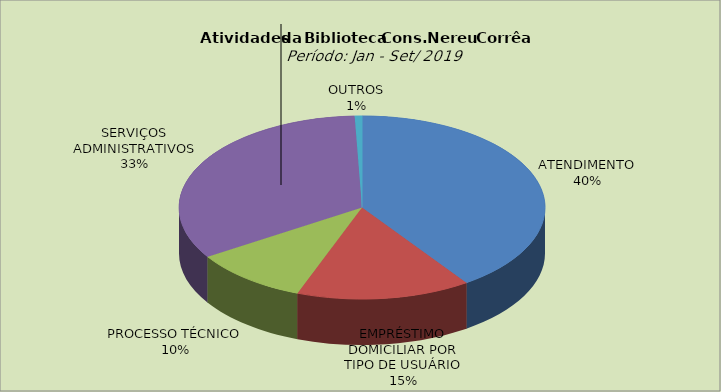
| Category | Series 0 |
|---|---|
| ATENDIMENTO | 40.341 |
| EMPRÉSTIMO DOMICILIAR POR TIPO DE USUÁRIO | 15.393 |
| PROCESSO TÉCNICO | 10.227 |
| SERVIÇOS ADMINISTRATIVOS | 33.396 |
| OUTROS | 0.643 |